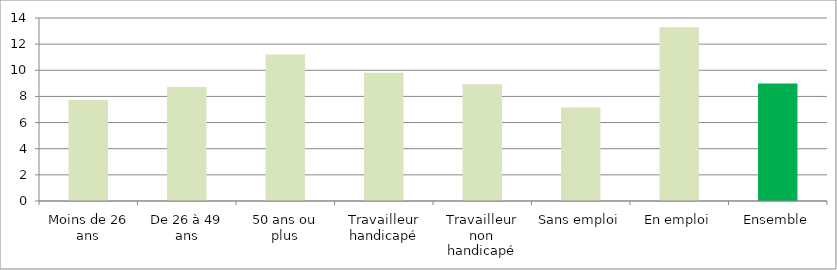
| Category | Series 0 |
|---|---|
| Moins de 26 ans | 7.75 |
| De 26 à 49 ans | 8.72 |
| 50 ans ou plus | 11.2 |
| Travailleur handicapé | 9.82 |
| Travailleur non handicapé | 8.93 |
| Sans emploi | 7.15 |
| En emploi | 13.3 |
| Ensemble | 8.99 |